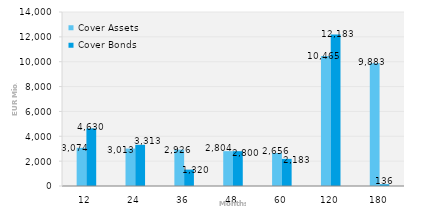
| Category | Cover Assets | Cover Bonds |
|---|---|---|
| 12.0 | 3073.63 | 4629.624 |
| 24.0 | 3012.669 | 3312.74 |
| 36.0 | 2926.492 | 1320 |
| 48.0 | 2804.119 | 2800 |
| 60.0 | 2656.438 | 2183 |
| 120.0 | 10465.166 | 12183 |
| 180.0 | 9882.781 | 136 |